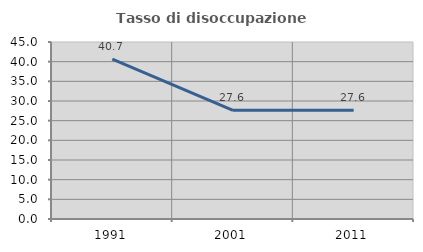
| Category | Tasso di disoccupazione giovanile  |
|---|---|
| 1991.0 | 40.65 |
| 2001.0 | 27.619 |
| 2011.0 | 27.624 |